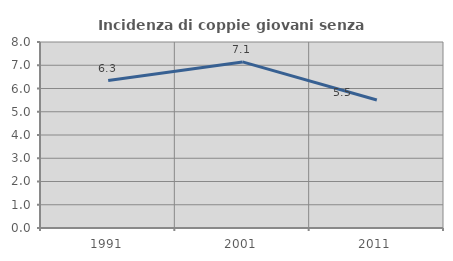
| Category | Incidenza di coppie giovani senza figli |
|---|---|
| 1991.0 | 6.343 |
| 2001.0 | 7.143 |
| 2011.0 | 5.507 |